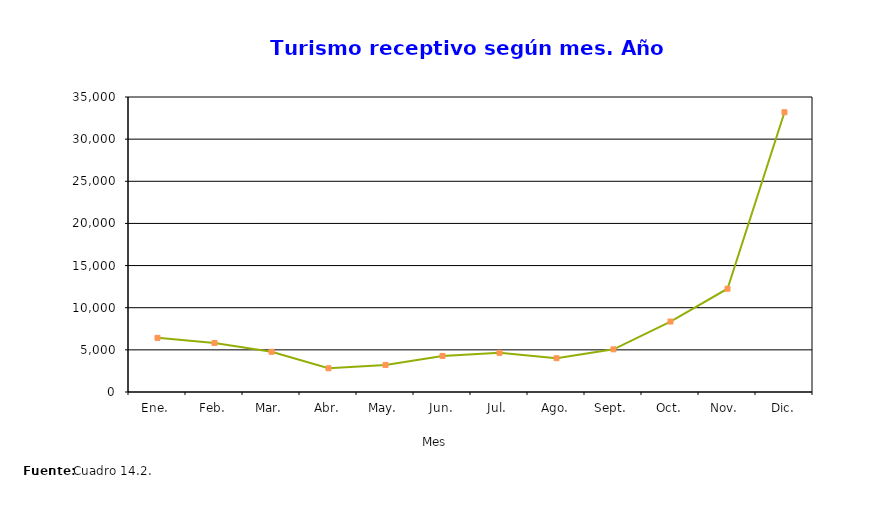
| Category | Series 0 |
|---|---|
| Ene. | 6423 |
| Feb. | 5817 |
| Mar. | 4769 |
| Abr. | 2815 |
| May. | 3212 |
| Jun. | 4283 |
| Jul. | 4648 |
| Ago. | 4009 |
| Sept. | 5062 |
| Oct. | 8359 |
| Nov. | 12255 |
| Dic. | 33194 |